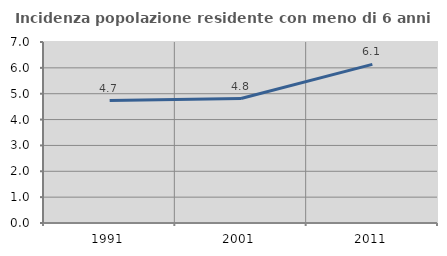
| Category | Incidenza popolazione residente con meno di 6 anni |
|---|---|
| 1991.0 | 4.737 |
| 2001.0 | 4.813 |
| 2011.0 | 6.135 |